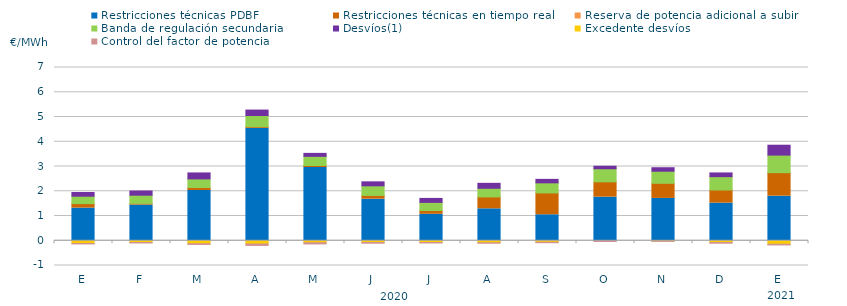
| Category | Restricciones técnicas PDBF | Restricciones técnicas en tiempo real | Reserva de potencia adicional a subir | Banda de regulación secundaria | Desvíos(1) | Excedente desvíos | Control del factor de potencia |
|---|---|---|---|---|---|---|---|
| E | 1.32 | 0.18 | 0 | 0.3 | 0.15 | -0.11 | -0.06 |
| F | 1.44 | 0.07 | 0 | 0.33 | 0.17 | -0.07 | -0.06 |
| M | 2.03 | 0.12 | 0 | 0.35 | 0.24 | -0.12 | -0.07 |
| A | 4.54 | 0.07 | 0 | 0.45 | 0.22 | -0.13 | -0.1 |
| M | 2.96 | 0.08 | 0 | 0.37 | 0.12 | -0.08 | -0.09 |
| J | 1.68 | 0.15 | 0 | 0.39 | 0.16 | -0.07 | -0.07 |
| J | 1.07 | 0.15 | 0 | 0.33 | 0.16 | -0.07 | -0.06 |
| A | 1.29 | 0.48 | 0 | 0.35 | 0.2 | -0.08 | -0.06 |
| S | 1.05 | 0.88 | 0 | 0.41 | 0.14 | -0.06 | -0.06 |
| O | 1.76 | 0.62 | 0 | 0.53 | 0.1 | 0 | -0.07 |
| N | 1.71 | 0.61 | 0 | 0.49 | 0.14 | -0.01 | -0.05 |
| D | 1.52 | 0.53 | 0 | 0.54 | 0.15 | -0.07 | -0.07 |
| E | 1.8 | 0.95 | 0 | 0.71 | 0.4 | -0.14 | -0.07 |